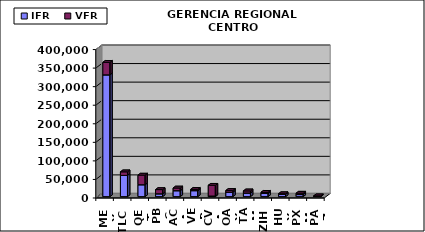
| Category | IFR | VFR |
|---|---|---|
| MEX | 328205 | 33548 |
| TLC | 57256 | 9567 |
| QET | 32075 | 25830 |
| PBC | 7690 | 11273 |
| ACA | 16043 | 7150 |
| VER | 16196 | 3326 |
| CVA | 1705 | 28872 |
| OAX | 12190 | 4436 |
| TAM | 9857 | 5570 |
| ZIH | 8899 | 2715 |
| HUX | 6357 | 1483 |
| PXM | 5601 | 3658 |
| PAZ | 539 | 1569 |